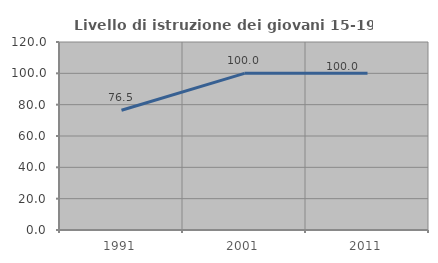
| Category | Livello di istruzione dei giovani 15-19 anni |
|---|---|
| 1991.0 | 76.471 |
| 2001.0 | 100 |
| 2011.0 | 100 |